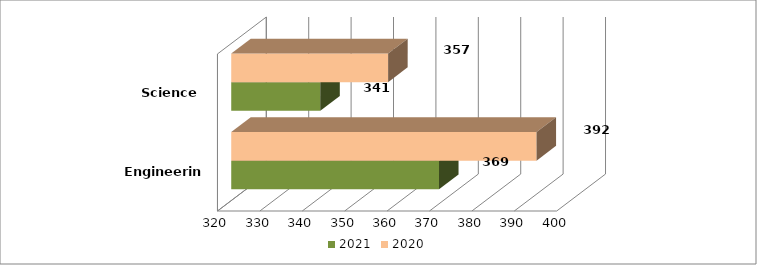
| Category | 2021 | 2020 |
|---|---|---|
| Engineering | 369 | 392 |
| Science | 341 | 357 |